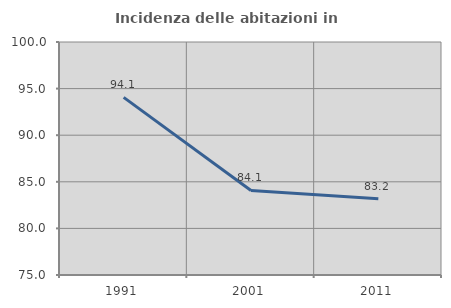
| Category | Incidenza delle abitazioni in proprietà  |
|---|---|
| 1991.0 | 94.059 |
| 2001.0 | 84.071 |
| 2011.0 | 83.178 |